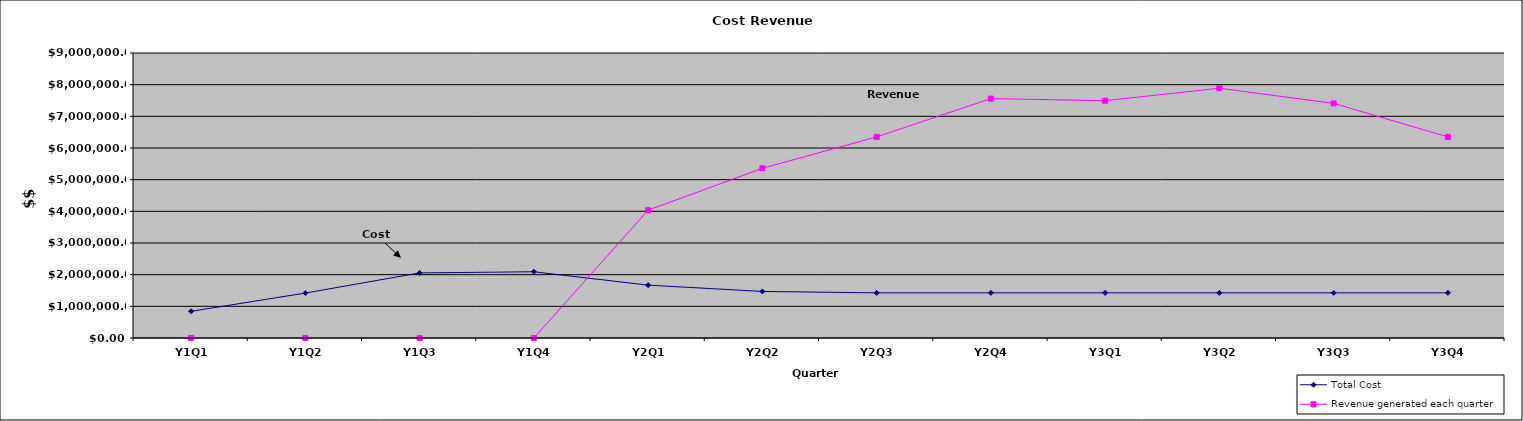
| Category | Total Cost | Revenue generated each quarter |
|---|---|---|
| Y1Q1 | 843094.473 | 0 |
| Y1Q2 | 1418898.007 | 0 |
| Y1Q3 | 2055241.983 | 0 |
| Y1Q4 | 2091192.425 | 0 |
| Y2Q1 | 1669132.425 | 4035150 |
| Y2Q2 | 1470367.425 | 5358150 |
| Y2Q3 | 1425802.425 | 6350400 |
| Y2Q4 | 1425802.425 | 7560000 |
| Y3Q1 | 1425802.425 | 7493850 |
| Y3Q2 | 1425802.425 | 7888387.5 |
| Y3Q3 | 1425802.425 | 7408800 |
| Y3Q4 | 1425802.425 | 6350400 |